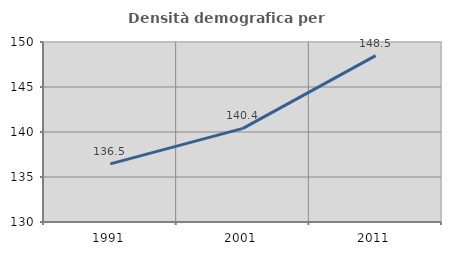
| Category | Densità demografica |
|---|---|
| 1991.0 | 136.463 |
| 2001.0 | 140.4 |
| 2011.0 | 148.486 |